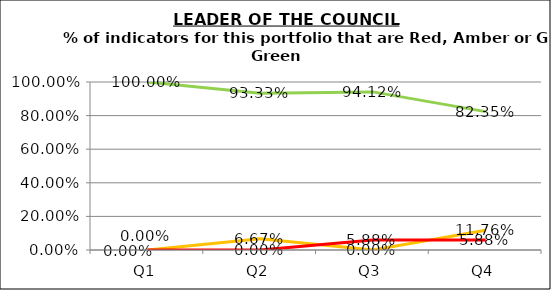
| Category | Green | Amber | Red |
|---|---|---|---|
| Q1 | 1 | 0 | 0 |
| Q2 | 0.933 | 0.067 | 0 |
| Q3 | 0.941 | 0 | 0.059 |
| Q4 | 0.824 | 0.118 | 0.059 |